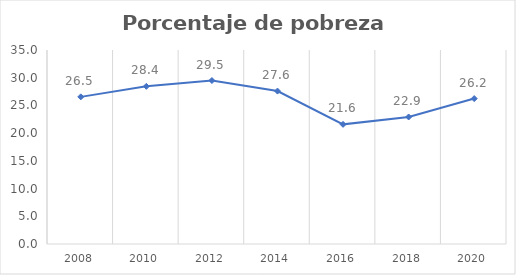
| Category | Series 0 |
|---|---|
| 2008.0 | 26.545 |
| 2010.0 | 28.441 |
| 2012.0 | 29.489 |
| 2014.0 | 27.588 |
| 2016.0 | 21.587 |
| 2018.0 | 22.915 |
| 2020.0 | 26.236 |